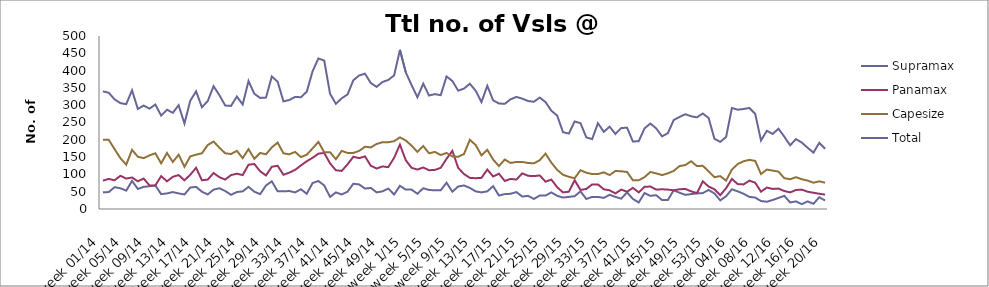
| Category | Supramax | Panamax | Capesize | Total |
|---|---|---|---|---|
| week 01/14 | 48 | 82 | 200 | 340 |
| week 02/14 | 49 | 87 | 200 | 336 |
| week 03/14 | 63 | 83 | 173 | 317 |
| week 04/14 | 60 | 96 | 147 | 306 |
| week 05/14 | 53 | 88 | 128 | 303 |
| week 06/14 | 81 | 91 | 171 | 343 |
| week 07/14 | 58 | 80 | 151 | 289 |
| week 08/14 | 64 | 88 | 147 | 299 |
| week 09/14 | 66 | 68 | 155 | 290 |
| week 10/14 | 68 | 68 | 161 | 302 |
| week 11/14 | 43 | 95 | 132 | 270 |
| week 12/14 | 45 | 80 | 162 | 287 |
| week 13/14 | 49 | 93 | 136 | 278 |
| week 14/14 | 45 | 98 | 157 | 300 |
| week 15/14 | 42 | 83 | 122 | 247 |
| week 16/14 | 62 | 99 | 152 | 313 |
| week 17/14 | 64 | 119 | 157 | 340 |
| week 18/14 | 50 | 83 | 161 | 294 |
| week 19/14 | 42 | 85 | 185 | 312 |
| week 20/14 | 56 | 104 | 195 | 355 |
| week 21/14 | 60 | 92 | 177 | 329 |
| week 22/14 | 52 | 85 | 161 | 299 |
| week 23/14 | 41 | 98 | 159 | 298 |
| week 24/14 | 49 | 102 | 168 | 325 |
| week 25/14 | 51 | 98 | 147 | 302 |
| week 26/14 | 64 | 128 | 173 | 370 |
| week 27/14 | 50 | 130 | 145 | 333 |
| week 28/14 | 43 | 109 | 162 | 321 |
| week 29/14 | 68 | 97 | 158 | 322 |
| week 30/14 | 80 | 122 | 178 | 383 |
| week 31/14 | 51 | 125 | 192 | 368 |
| week 32/14 | 51 | 99 | 161 | 311 |
| week 33/14 | 52 | 105 | 158 | 315 |
| week 34/14 | 48 | 113 | 165 | 324 |
| week 35/14 | 57 | 126 | 150 | 323 |
| week 36/14 | 44 | 138 | 157 | 339 |
| week 37/14 | 75 | 148 | 175 | 398 |
| week 38/14 | 81 | 160 | 194 | 435 |
| week 39/14 | 68 | 162 | 164 | 429 |
| week 40/14 | 35 | 132 | 164 | 333 |
| week 41/14 | 48 | 112 | 144 | 304 |
| week 42/14 | 42 | 110 | 168 | 320 |
| week 43/14 | 50 | 129 | 162 | 331 |
| week 44/14 | 73 | 151 | 162 | 372 |
| week 45/14 | 71 | 147 | 168 | 386 |
| week 46/14 | 59 | 152 | 180 | 391 |
| week 47/14 | 61 | 125 | 178 | 364 |
| week 48/14 | 48 | 117 | 188 | 353 |
| week 49/14 | 51 | 123 | 193 | 367 |
| week 50/14 | 59 | 121 | 193 | 373 |
| week 51/14 | 42 | 148 | 196 | 386 |
| week 52/14 | 67 | 186 | 207 | 460 |
| week 1/15 | 56 | 141 | 198 | 395 |
| week 2/15 | 56 | 119 | 183 | 358 |
| week 3/15 | 44 | 114 | 165 | 323 |
| week 4/15 | 60 | 120 | 182 | 362 |
| week 5/15 | 55 | 112 | 161 | 328 |
| week 6/15 | 54 | 113 | 165 | 332 |
| week 7/15 | 54 | 119 | 156 | 329 |
| week 8/15 | 76 | 145 | 162 | 383 |
| week 9/15 | 50 | 168 | 152 | 370 |
| week 10/15 | 65 | 119 | 151 | 342 |
| week 11/15 | 68 | 101 | 159 | 348 |
| week 12/15 | 61 | 90 | 200 | 362 |
| week 13/15 | 51 | 89 | 185 | 342 |
| week 14/15 | 48 | 90 | 155 | 309 |
| week 15/15 | 51 | 114 | 171 | 356 |
| week 16/15 | 66 | 94 | 143 | 314 |
| week 17/15 | 39 | 102 | 124 | 305 |
| week 18/15 | 43 | 81 | 143 | 304 |
| week 19/15 | 44 | 87 | 133 | 317 |
| week 20/15 | 49 | 85 | 136 | 324 |
| week 21/15 | 36 | 103 | 136 | 319 |
| week 22/15 | 38 | 96 | 133 | 312 |
| week 23/15 | 29 | 95 | 132 | 310 |
| week 24/15 | 39 | 97 | 141 | 322 |
| week 25/15 | 39 | 79 | 160 | 309 |
| week 26/15 | 48 | 85 | 134 | 284 |
| week 27/15 | 38 | 63 | 113 | 270 |
| week 28/15 | 33 | 48 | 99 | 222 |
| week 29/15 | 35 | 50 | 93 | 218 |
| week 30/15 | 37 | 83 | 89 | 253 |
| week 31/15 | 51 | 55 | 112 | 248 |
| week 32/15 | 29 | 58 | 105 | 207 |
| week 33/15 | 35 | 71 | 101 | 202 |
| week 34/15 | 35 | 71 | 101 | 248 |
| week 35/15 | 32 | 57 | 106 | 223 |
| week 36/15 | 41 | 54 | 98 | 238 |
| week 37/15 | 35 | 45 | 110 | 217 |
| week 38/15 | 30 | 56 | 109 | 234 |
| week 39/15 | 48 | 50 | 107 | 235 |
| week 40/15 | 29 | 61 | 83 | 195 |
| week 41/15 | 19 | 48 | 83 | 196 |
| week 42/15 | 46 | 64 | 92 | 233 |
| week 43/15 | 38 | 65 | 107 | 247 |
| week 44/15 | 40 | 56 | 103 | 233 |
| week 45/15 | 26 | 57 | 98 | 210 |
| week 46/15 | 26 | 56 | 103 | 219 |
| week 47/15 | 54 | 54 | 110 | 257 |
| week 48/15 | 47 | 57 | 124 | 266 |
| week 49/15 | 41 | 58 | 127 | 274 |
| week 50/15 | 43 | 51 | 138 | 268 |
| week 51/15 | 45 | 46 | 124 | 265 |
| week 52/15 | 46 | 80 | 125 | 276 |
| week 53/15 | 55 | 65 | 109 | 263 |
| week 01/16 | 45 | 57 | 92 | 203 |
| week 02/16 | 25 | 40 | 95 | 194 |
| week 03/16 | 37 | 60 | 82 | 208 |
| week 04/16 | 57 | 87 | 114 | 292 |
| week 05/16 | 51 | 72 | 130 | 287 |
| week 06/16 | 44 | 71 | 138 | 289 |
| week 07/16 | 35 | 82 | 142 | 292 |
| week 08/16 | 33 | 76 | 139 | 275 |
| week 09/16 | 23 | 50 | 101 | 198 |
| week 10/16 | 21 | 62 | 114 | 226 |
| week 11/16 | 26 | 58 | 111 | 217 |
| week 12/16 | 32 | 59 | 108 | 232 |
| week 13/16 | 38 | 52 | 89 | 209 |
| week 14/16 | 19 | 48 | 86 | 184 |
| week 15/16 | 22 | 55 | 92 | 202 |
| week 16/16 | 14 | 56 | 86 | 192 |
| week 17/16 | 22 | 50 | 82 | 177 |
| week 18/16 | 15 | 47 | 76 | 163 |
| week 19/16 | 34 | 44 | 80 | 191.071 |
| week 20/16 | 24.6 | 41.714 | 76 | 174.154 |